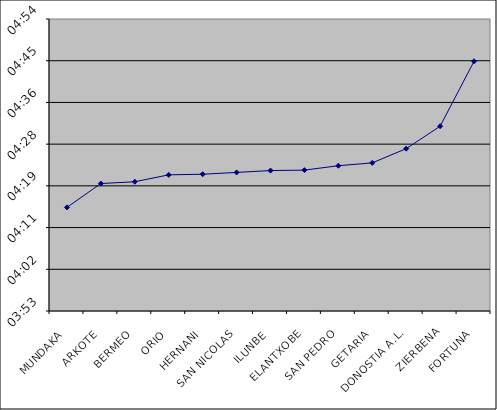
| Category | Series 0 |
|---|---|
| MUNDAKA | 0.003 |
| ARKOTE | 0.003 |
| BERMEO | 0.003 |
| ORIO | 0.003 |
| HERNANI | 0.003 |
| SAN NICOLAS | 0.003 |
| ILUNBE | 0.003 |
| ELANTXOBE | 0.003 |
| SAN PEDRO | 0.003 |
| GETARIA | 0.003 |
| DONOSTIA A.L. | 0.003 |
| ZIERBENA | 0.003 |
| FORTUNA | 0.003 |